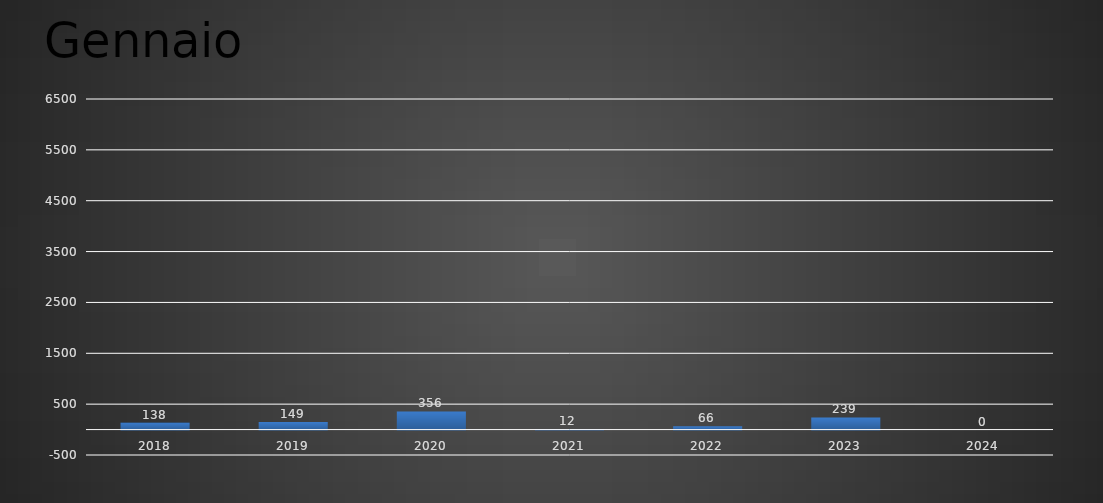
| Category | Gennaio |
|---|---|
| 2018.0 | 138 |
| 2019.0 | 149 |
| 2020.0 | 356 |
| 2021.0 | 12 |
| 2022.0 | 66 |
| 2023.0 | 239 |
| 2024.0 | 0 |